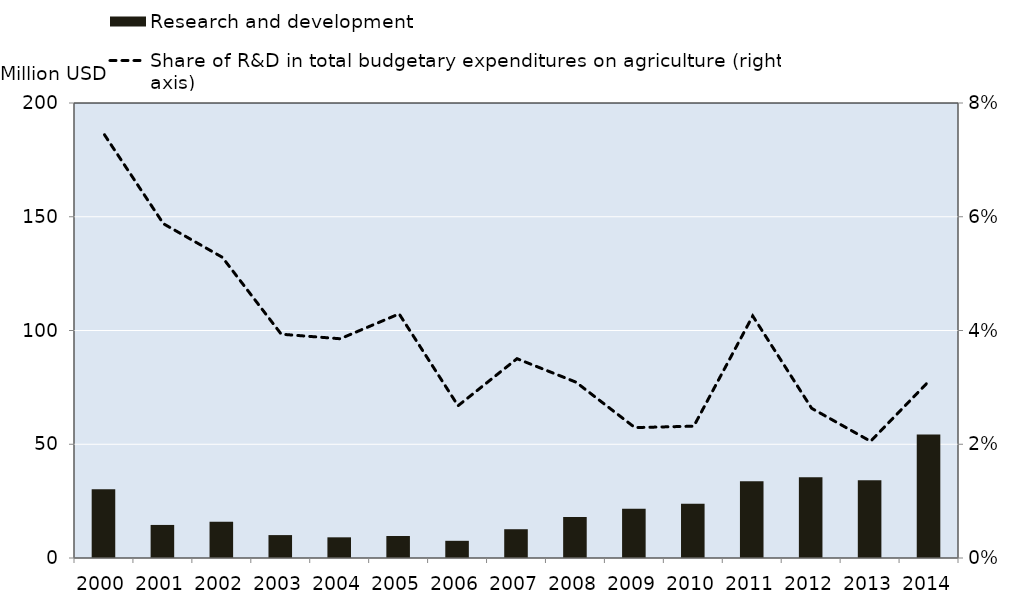
| Category | Research and development |
|---|---|
| 2000.0 | 30.211 |
| 2001.0 | 14.532 |
| 2002.0 | 15.893 |
| 2003.0 | 10.069 |
| 2004.0 | 9.089 |
| 2005.0 | 9.661 |
| 2006.0 | 7.556 |
| 2007.0 | 12.651 |
| 2008.0 | 18.018 |
| 2009.0 | 21.608 |
| 2010.0 | 23.818 |
| 2011.0 | 33.712 |
| 2012.0 | 35.46 |
| 2013.0 | 34.163 |
| 2014.0 | 54.265 |